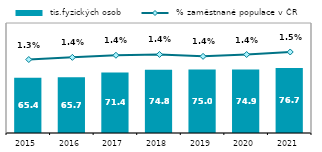
| Category |  tis.fyzických osob |
|---|---|
| 2015.0 | 65.385 |
| 2016.0 | 65.745 |
| 2017.0 | 71.399 |
| 2018.0 | 74.838 |
| 2019.0 | 74.998 |
| 2020.0 | 74.912 |
| 2021.0 | 76.682 |